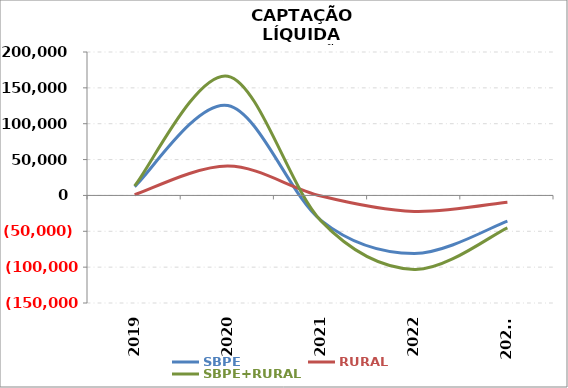
| Category | SBPE | RURAL | SBPE+RURAL |
|---|---|---|---|
| 2019 | 12389.575 | 937.497 | 13327.072 |
| 2020 | 125352.739 | 40957.163 | 166309.902 |
| 2021 | -34755.497 | -741.413 | -35496.91 |
| 2022 | -80944.485 | -22292.691 | -103237.176 |
| 2023* | -35793.696 | -9352.052 | -45145.748 |